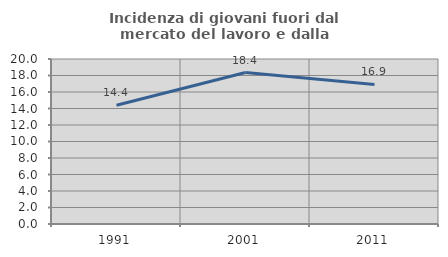
| Category | Incidenza di giovani fuori dal mercato del lavoro e dalla formazione  |
|---|---|
| 1991.0 | 14.396 |
| 2001.0 | 18.362 |
| 2011.0 | 16.91 |